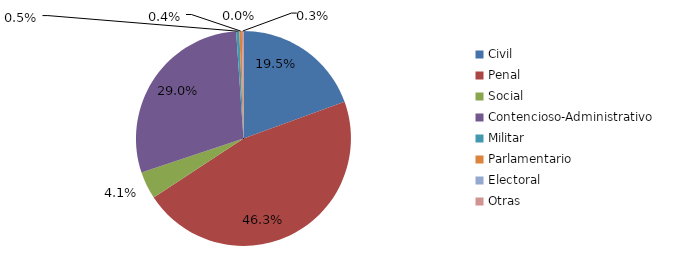
| Category | Series 0 |
|---|---|
| Civil | 1134 |
| Penal | 2696 |
| Social | 241 |
| Contencioso-Administrativo | 1691 |
| Militar | 28 |
| Parlamentario | 22 |
| Electoral | 0 |
| Otras | 14 |